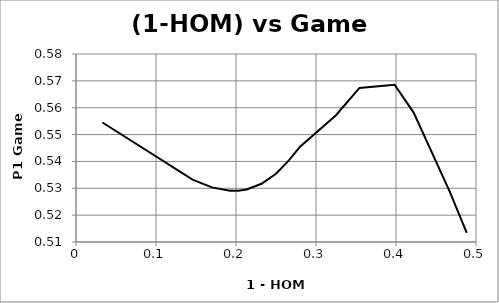
| Category | game |
|---|---|
| 0.0331 | 0.554 |
| 0.1457 | 0.533 |
| 0.1699 | 0.53 |
| 0.1924 | 0.529 |
| 0.1944 | 0.529 |
| 0.1967 | 0.529 |
| 0.1987 | 0.529 |
| 0.2005 | 0.529 |
| 0.20279 | 0.529 |
| 0.2133 | 0.53 |
| 0.2318 | 0.532 |
| 0.25 | 0.535 |
| 0.264 | 0.54 |
| 0.2668 | 0.541 |
| 0.2804 | 0.546 |
| 0.325 | 0.557 |
| 0.3543 | 0.567 |
| 0.3982 | 0.569 |
| 0.4219 | 0.558 |
| 0.4669 | 0.529 |
| 0.4846 | 0.516 |
| 0.4884 | 0.513 |